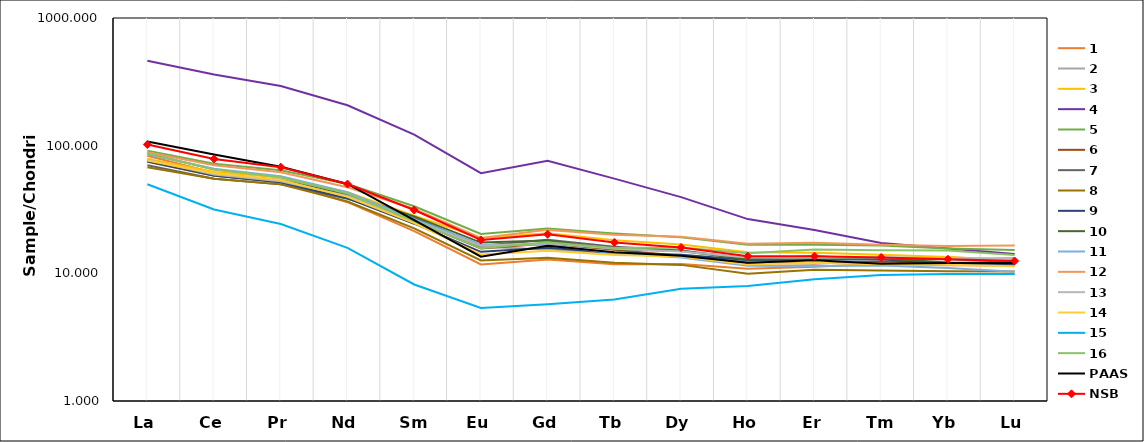
| Category | 1 | 2 | 3 | 4 | 5 | 6 | 7 | 8 | 9 | 10 | 11 | 12 | 13 | 14 | 15 | 16 | PAAS | NSB |
|---|---|---|---|---|---|---|---|---|---|---|---|---|---|---|---|---|---|---|
| 0 | 83.283 | 87.277 | 79.177 | 462.217 | 91.466 | 74.737 | 70.296 | 67.838 | 75.63 | 76.329 | 85.685 | 88.952 | 77.641 | 76.524 | 49.908 | 86.914 |  | 102.117 |
| 1 | 61.266 | 65.009 | 62.218 | 360.28 | 72.077 | 58.036 | 55.117 | 55.138 | 58.293 | 59.694 | 65.928 | 70.302 | 59.544 | 60.795 | 31.643 | 64.966 |  | 78.769 |
| 2 | 52.028 | 56.429 | 56.36 | 292.859 | 64.254 | 51.7 | 49.756 | 49.756 | 51.586 | 53.882 | 57.634 | 61.851 | 52.516 | 53.889 | 24.367 | 56.49 |  | 67.835 |
| 3 | 36.081 | 41.331 | 43.17 | 207.323 | 50.096 | 39.626 | 38.439 | 36.541 | 38.647 | 41.168 | 43.259 | 47.174 | 40.323 | 39.7 | 15.838 | 42.236 |  | 50.06 |
| 4 | 21.427 | 25.419 | 28.338 | 121.964 | 33.552 | 25.809 | 27.159 | 22.477 | 24.478 | 27.934 | 26.565 | 31.884 | 25.819 | 24.773 | 8.18 | 25.695 |  | 31.342 |
| 5 | 11.742 | 16.119 | 18.906 | 60.831 | 20.357 | 15.678 | 16.434 | 12.613 | 14.732 | 17.405 | 16.838 | 18.957 | 16.422 | 14.063 | 5.36 | 15.703 |  | 18.26 |
| 6 | 12.804 | 15.404 | 20.582 | 76.041 | 22.495 | 17.108 | 18.328 | 13.243 | 15.839 | 18.067 | 16.706 | 21.897 | 17.167 | 15.005 | 5.737 | 17.507 |  | 20.246 |
| 7 | 11.758 | 14.367 | 18.189 | 55.172 | 20.522 | 15.267 | 16.186 | 12.107 | 14.496 | 15.451 | 14.386 | 20.099 | 15.58 | 13.908 | 6.228 | 15.8 |  | 17.47 |
| 8 | 11.842 | 13.825 | 16.786 | 39.525 | 19.16 | 13.725 | 15.111 | 11.647 | 13.957 | 14.96 | 13.276 | 19.365 | 14.816 | 13.554 | 7.559 | 15.97 |  | 15.942 |
| 9 | 10.877 | 12.514 | 14.642 | 26.594 | 16.757 | 12.06 | 13.064 | 9.944 | 12.729 | 12.861 | 11.462 | 17.068 | 13.291 | 11.701 | 7.96 | 14.367 |  | 13.618 |
| 10 | 11.239 | 12.979 | 14.491 | 21.846 | 16.723 | 11.964 | 13.621 | 10.686 | 12.812 | 12.957 | 11.389 | 17.347 | 13.217 | 12.109 | 8.994 | 15.383 |  | 13.61 |
| 11 | 11.873 | 13.202 | 14.01 | 17.275 | 16.553 | 12.364 | 12.884 | 10.544 | 12.884 | 13.086 | 11.526 | 16.726 | 13.375 | 11.786 | 9.706 | 15.195 |  | 13.312 |
| 12 | 11.556 | 13.393 | 13.409 | 15.634 | 15.684 | 12.005 | 12.903 | 10.402 | 11.906 | 12.178 | 11.004 | 16.376 | 13.088 | 11.671 | 9.887 | 15.099 |  | 12.887 |
| 13 | 11.536 | 12.73 | 12.677 | 14.162 | 15.249 | 11.934 | 12.252 | 10.343 | 11.722 | 12.093 | 10.29 | 16.522 | 13.18 | 11.377 | 9.892 | 13.923 |  | 12.493 |